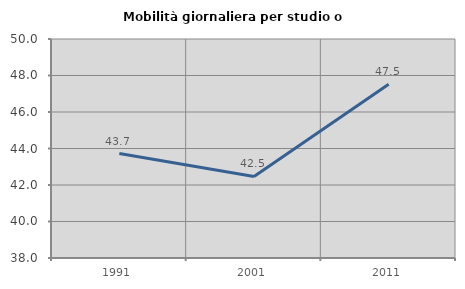
| Category | Mobilità giornaliera per studio o lavoro |
|---|---|
| 1991.0 | 43.725 |
| 2001.0 | 42.469 |
| 2011.0 | 47.524 |